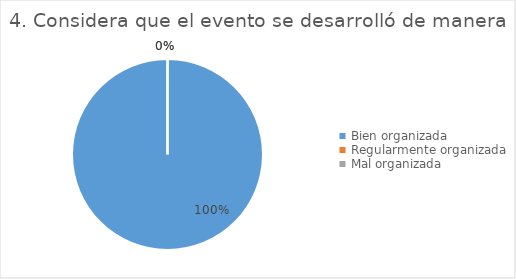
| Category | Series 0 |
|---|---|
| Bien organizada | 9 |
| Regularmente organizada | 0 |
| Mal organizada | 0 |